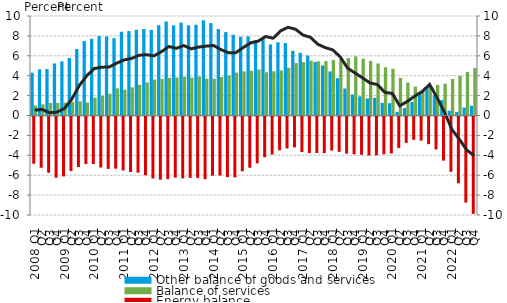
| Category | Other balance of goods and services | Balance of services |
|---|---|---|
| 2008 Q1 | 4.299 | 0.991 |
| Q2 | 4.634 | 1.126 |
| Q3 | 4.673 | 1.261 |
| Q4 | 5.232 | 1.264 |
| 2009 Q1 | 5.436 | 1.297 |
| Q2 | 5.771 | 1.387 |
| Q3 | 6.679 | 1.424 |
| Q4 | 7.484 | 1.307 |
| 2010 Q1 | 7.713 | 1.775 |
| Q2 | 7.991 | 1.992 |
| Q3 | 7.944 | 2.199 |
| Q4 | 7.776 | 2.729 |
| 2011 Q1 | 8.414 | 2.594 |
| Q2 | 8.486 | 2.83 |
| Q3 | 8.617 | 3.083 |
| Q4 | 8.696 | 3.32 |
| 2012 Q1 | 8.607 | 3.608 |
| Q2 | 9.073 | 3.681 |
| Q3 | 9.448 | 3.782 |
| Q4 | 9.061 | 3.828 |
| 2013 Q1 | 9.341 | 3.903 |
| Q2 | 9.06 | 3.811 |
| Q3 | 9.126 | 3.931 |
| Q4 | 9.561 | 3.711 |
| 2014 Q1 | 9.279 | 3.702 |
| Q2 | 8.69 | 3.872 |
| Q3 | 8.379 | 4.019 |
| Q4 | 8.117 | 4.317 |
| 2015 Q1 | 7.912 | 4.429 |
| Q2 | 7.955 | 4.501 |
| Q3 | 7.544 | 4.636 |
| Q4 | 7.681 | 4.351 |
| 2016 Q1 | 7.139 | 4.446 |
| Q2 | 7.362 | 4.537 |
| Q3 | 7.281 | 4.801 |
| Q4 | 6.509 | 5.268 |
| 2017 Q1 | 6.306 | 5.358 |
| Q2 | 6.029 | 5.515 |
| Q3 | 5.387 | 5.445 |
| Q4 | 5.033 | 5.471 |
| 2018 Q1 | 4.429 | 5.587 |
| Q2 | 3.744 | 5.699 |
| Q3 | 2.718 | 5.775 |
| Q4 | 2.118 | 5.944 |
| 2019 Q1 | 1.924 | 5.699 |
| Q2 | 1.706 | 5.486 |
| Q3 | 1.772 | 5.23 |
| Q4 | 1.275 | 4.844 |
| 2020 Q1 | 1.238 | 4.692 |
| Q2 | 0.37 | 3.78 |
| Q3 | 0.742 | 3.316 |
| Q4 | 1.371 | 2.908 |
| 2021 Q1 | 2.357 | 2.468 |
| Q2 | 2.901 | 2.996 |
| Q3 | 2.043 | 3.072 |
| Q4 | 1.556 | 3.196 |
| 2022 Q1 | 0.482 | 3.668 |
| Q2 | 0.349 | 3.975 |
| Q3 | 0.799 | 4.373 |
| Q4 | 0.976 | 4.759 |